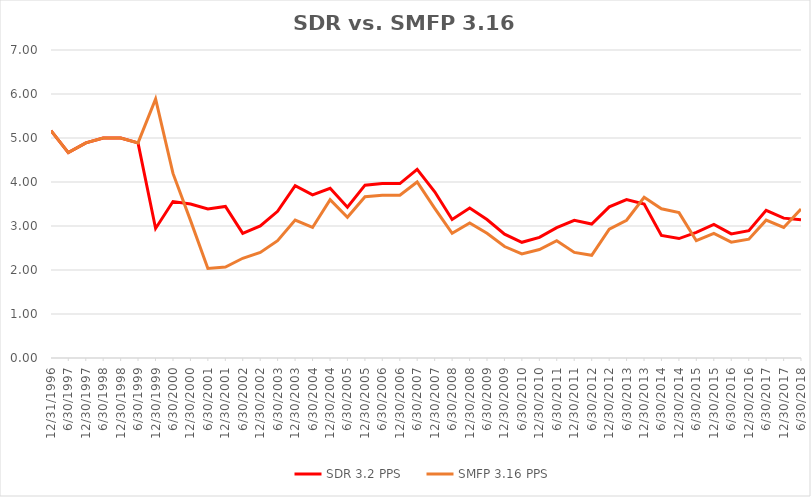
| Category | SDR 3.2 PPS | SMFP 3.16 PPS |
|---|---|---|
| 12/31/96 | 5.167 | 5.167 |
| 6/30/97 | 4.667 | 4.667 |
| 12/31/97 | 4.889 | 4.889 |
| 6/30/98 | 5 | 5 |
| 12/31/98 | 5 | 5 |
| 6/30/99 | 4.889 | 4.889 |
| 12/31/99 | 2.944 | 5.889 |
| 6/30/00 | 3.556 | 4.195 |
| 12/31/00 | 3.5 | 3.122 |
| 6/30/01 | 3.389 | 2.033 |
| 12/31/01 | 3.444 | 2.067 |
| 6/30/02 | 2.833 | 2.267 |
| 12/31/02 | 3 | 2.4 |
| 6/30/03 | 3.333 | 2.667 |
| 12/31/03 | 3.917 | 3.133 |
| 6/30/04 | 3.708 | 2.967 |
| 12/31/04 | 3.857 | 3.6 |
| 6/30/05 | 3.429 | 3.2 |
| 12/31/05 | 3.929 | 3.667 |
| 6/30/06 | 3.964 | 3.7 |
| 12/31/06 | 3.964 | 3.7 |
| 6/30/07 | 4.286 | 4 |
| 12/31/07 | 3.778 | 3.4 |
| 6/30/08 | 3.148 | 2.833 |
| 12/31/08 | 3.407 | 3.067 |
| 6/30/09 | 3.148 | 2.833 |
| 12/31/09 | 2.815 | 2.533 |
| 6/30/10 | 2.63 | 2.367 |
| 12/31/10 | 2.741 | 2.467 |
| 6/30/11 | 2.963 | 2.667 |
| 12/31/11 | 3.13 | 2.4 |
| 6/30/12 | 3.043 | 2.333 |
| 12/31/12 | 3.435 | 2.926 |
| 6/30/13 | 3.6 | 3.13 |
| 12/31/13 | 3.5 | 3.652 |
| 6/30/14 | 2.786 | 3.391 |
| 12/31/14 | 2.714 | 3.304 |
| 6/30/15 | 2.857 | 2.667 |
| 12/31/15 | 3.036 | 2.833 |
| 6/30/16 | 2.821 | 2.633 |
| 12/31/16 | 2.893 | 2.7 |
| 6/30/17 | 3.357 | 3.133 |
| 12/31/17 | 3.179 | 2.967 |
| 6/30/18 | 3.143 | 3.385 |